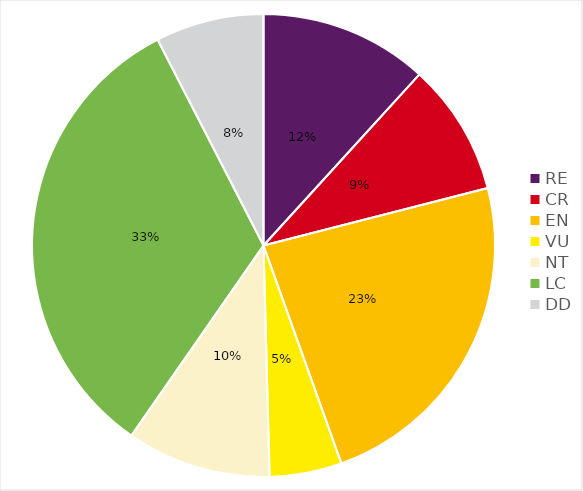
| Category | RE CR EN VU NT LC DD |
|---|---|
| RE | 0.118 |
| CR | 0.092 |
| EN | 0.235 |
| VU | 0.05 |
| NT | 0.101 |
| LC | 0.328 |
| DD | 0.076 |